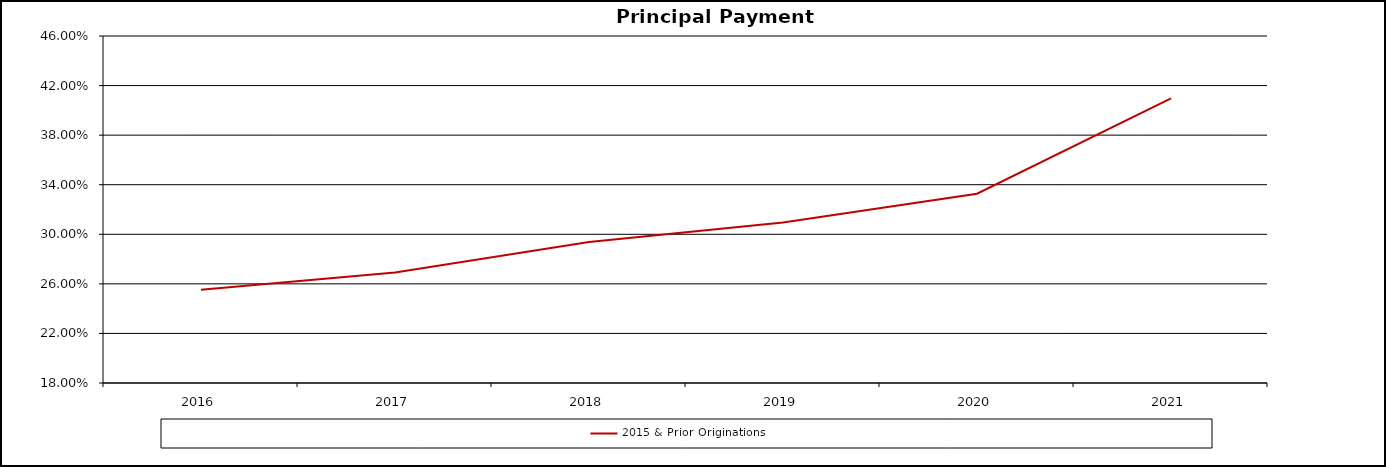
| Category | 2015 & Prior Originations |
|---|---|
| 2016.0 | 0.255 |
| 2017.0 | 0.269 |
| 2018.0 | 0.294 |
| 2019.0 | 0.31 |
| 2020.0 | 0.333 |
| 2021.0 | 0.41 |